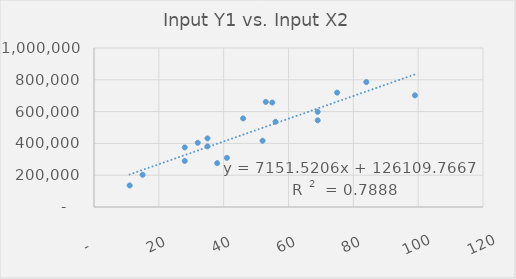
| Category | Input X2 |
|---|---|
| 11.0 | 135437 |
| 15.0 | 202750 |
| 55.0 | 656910 |
| 69.0 | 598518 |
| 84.0 | 785859 |
| 28.0 | 374682 |
| 75.0 | 719357 |
| 35.0 | 381170 |
| 32.0 | 403878 |
| 38.0 | 275740 |
| 46.0 | 557157 |
| 52.0 | 416854 |
| 69.0 | 544992 |
| 41.0 | 308991 |
| 53.0 | 660965 |
| 99.0 | 702326 |
| 56.0 | 536071 |
| 28.0 | 289527 |
| 35.0 | 431452 |